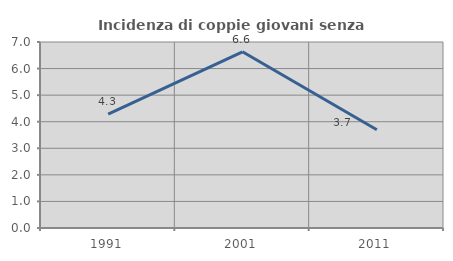
| Category | Incidenza di coppie giovani senza figli |
|---|---|
| 1991.0 | 4.288 |
| 2001.0 | 6.631 |
| 2011.0 | 3.696 |